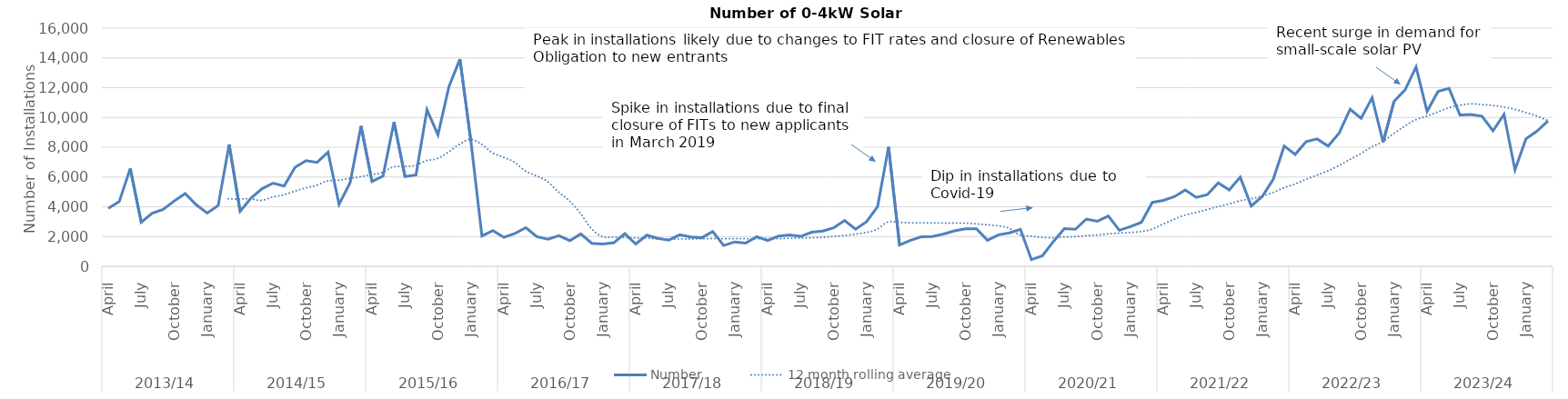
| Category | Number |
|---|---|
| 0 | 3893 |
| 1 | 4344 |
| 2 | 6571 |
| 3 | 2964 |
| 4 | 3571 |
| 5 | 3826 |
| 6 | 4390 |
| 7 | 4892 |
| 8 | 4135 |
| 9 | 3578 |
| 10 | 4082 |
| 11 | 8183 |
| 12 | 3699 |
| 13 | 4588 |
| 14 | 5218 |
| 15 | 5589 |
| 16 | 5388 |
| 17 | 6656 |
| 18 | 7097 |
| 19 | 6982 |
| 20 | 7673 |
| 21 | 4169 |
| 22 | 5606 |
| 23 | 9427 |
| 24 | 5698 |
| 25 | 6057 |
| 26 | 9699 |
| 27 | 6027 |
| 28 | 6143 |
| 29 | 10515 |
| 30 | 8828 |
| 31 | 12075 |
| 32 | 13915 |
| 33 | 8390 |
| 34 | 2036 |
| 35 | 2400 |
| 36 | 1943 |
| 37 | 2202 |
| 38 | 2597 |
| 39 | 1988 |
| 40 | 1817 |
| 41 | 2056 |
| 42 | 1726 |
| 43 | 2175 |
| 44 | 1546 |
| 45 | 1501 |
| 46 | 1585 |
| 47 | 2192 |
| 48 | 1494 |
| 49 | 2091 |
| 50 | 1875 |
| 51 | 1760 |
| 52 | 2116 |
| 53 | 1973 |
| 54 | 1917 |
| 55 | 2333 |
| 56 | 1400 |
| 57 | 1639 |
| 58 | 1556 |
| 59 | 1992 |
| 60 | 1726 |
| 61 | 2036 |
| 62 | 2105 |
| 63 | 2011 |
| 64 | 2285 |
| 65 | 2369 |
| 66 | 2583 |
| 67 | 3079 |
| 68 | 2491 |
| 69 | 2992 |
| 70 | 4002 |
| 71 | 8021 |
| 72 | 1424 |
| 73 | 1745 |
| 74 | 1983 |
| 75 | 2004 |
| 76 | 2165 |
| 77 | 2377 |
| 78 | 2522 |
| 79 | 2518 |
| 80 | 1752 |
| 81 | 2118 |
| 82 | 2247 |
| 83 | 2486 |
| 84 | 449 |
| 85 | 706 |
| 86 | 1668 |
| 87 | 2537 |
| 88 | 2488 |
| 89 | 3175 |
| 90 | 3026 |
| 91 | 3379 |
| 92 | 2424 |
| 93 | 2660 |
| 94 | 2950 |
| 95 | 4292 |
| 96 | 4426 |
| 97 | 4677 |
| 98 | 5131 |
| 99 | 4633 |
| 100 | 4811 |
| 101 | 5608 |
| 102 | 5129 |
| 103 | 5993 |
| 104 | 4053 |
| 105 | 4689 |
| 106 | 5843 |
| 107 | 8081 |
| 108 | 7521 |
| 109 | 8377 |
| 110 | 8556 |
| 111 | 8079 |
| 112 | 8955 |
| 113 | 10551 |
| 114 | 9940 |
| 115 | 11323 |
| 116 | 8340 |
| 117 | 11089 |
| 118 | 11858 |
| 119 | 13397 |
| 120 | 10407 |
| 121 | 11754 |
| 122 | 11954 |
| 123 | 10163 |
| 124 | 10202 |
| 125 | 10090 |
| 126 | 9101 |
| 127 | 10212 |
| 128 | 6477 |
| 129 | 8561 |
| 130 | 9080 |
| 131 | 9758 |